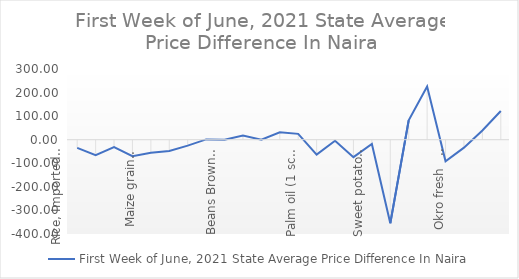
| Category | First Week of June, 2021 |
|---|---|
| Rice, Imported, High Quality Sold loose  (1 mudu) | -34.783 |
| Rice, Agric Sold Loose(Low quality) imported  (1 mudu) | -65.217 |
| Rice Local, Sold Loose   (1 mudu) | -31.304 |
| Maize grain, white sold loose   (1 mudu) | -70.217 |
| Maize grain, yellow sold loose   (1 mudu) | -55.652 |
| Sorghum (Guinea Corn) white or brown, sold loose   (1 mudu) | -47.609 |
| millet (jero or maiwa) sold loose   (1 mudu) | -25.217 |
| Beans: white black eye. Sold loose   (1 mudu) | 1.304 |
| Beans Brown, sold loose  (1 mudu) | 0 |
| Soya Beans, sold loose    (1 mudu) | 17.391 |
| Gari White, sold loose  (1 mudu) | 0 |
| Gari Yellow, sold loose   (1 mudu) | 31.739 |
| Palm oil (1 schnap bottle) | 24.783 |
| Yam tuber (1 Medium Size) | -63.043 |
| Cassava tuber | -4.348 |
| Irish potato  (4 Litre rubber) | -73.913 |
| Sweet potato  (5 Medium Size) | -18.261 |
| Local live chicken  | -354.348 |
| Groundnut - shelled (fresh) | 82.609 |
| Tomato fresh   (4 Litre rubber) | 226.087 |
| Okro fresh     (1 mudu) | -91.304 |
| Okro dried    (1 mudu) | -33.696 |
| Onion   (4 Litre rubber) | 39.13 |
| Pepper fresh   (4 Litre rubber) | 121.739 |